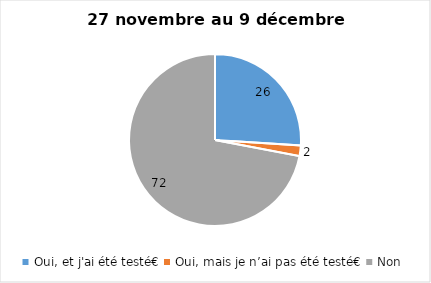
| Category | Series 0 |
|---|---|
| Oui, et j'ai été testé€ | 26 |
| Oui, mais je n’ai pas été testé€ | 2 |
| Non | 72 |